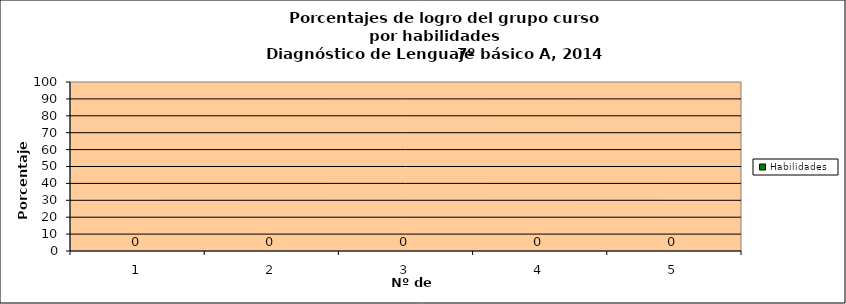
| Category | Habilidades |
|---|---|
| 0 | 0 |
| 1 | 0 |
| 2 | 0 |
| 3 | 0 |
| 4 | 0 |